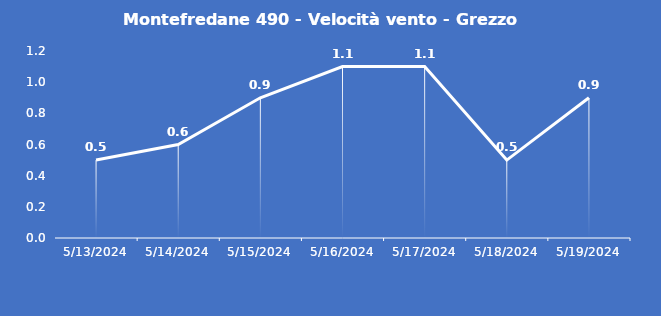
| Category | Montefredane 490 - Velocità vento - Grezzo (m/s) |
|---|---|
| 5/13/24 | 0.5 |
| 5/14/24 | 0.6 |
| 5/15/24 | 0.9 |
| 5/16/24 | 1.1 |
| 5/17/24 | 1.1 |
| 5/18/24 | 0.5 |
| 5/19/24 | 0.9 |